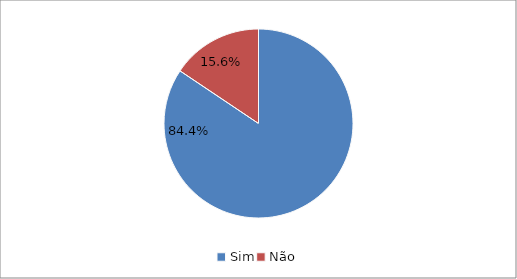
| Category | Series 0 |
|---|---|
| Sim | 0.844 |
| Não | 0.156 |